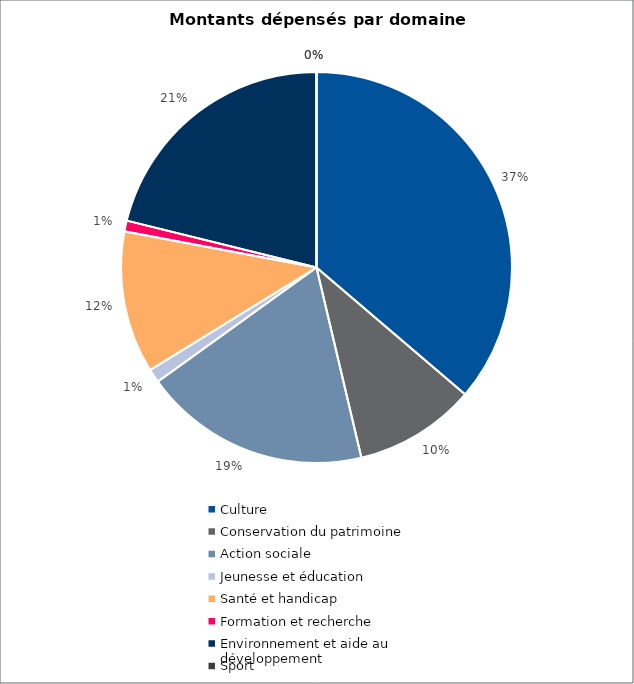
| Category | Series 0 |
|---|---|
| Culture | 11547950 |
| Conservation du patrimoine | 3205500 |
| Action sociale | 5977819 |
| Jeunesse et éducation | 363000 |
| Santé et handicap | 3742500 |
| Formation et recherche | 285000 |
| Environnement et aide au
développement | 6736500 |
| Sport | 0 |
| Autres projets d’utilité publique | 0 |